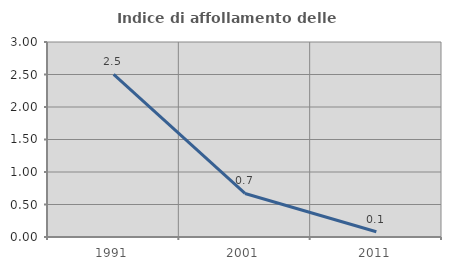
| Category | Indice di affollamento delle abitazioni  |
|---|---|
| 1991.0 | 2.502 |
| 2001.0 | 0.67 |
| 2011.0 | 0.08 |